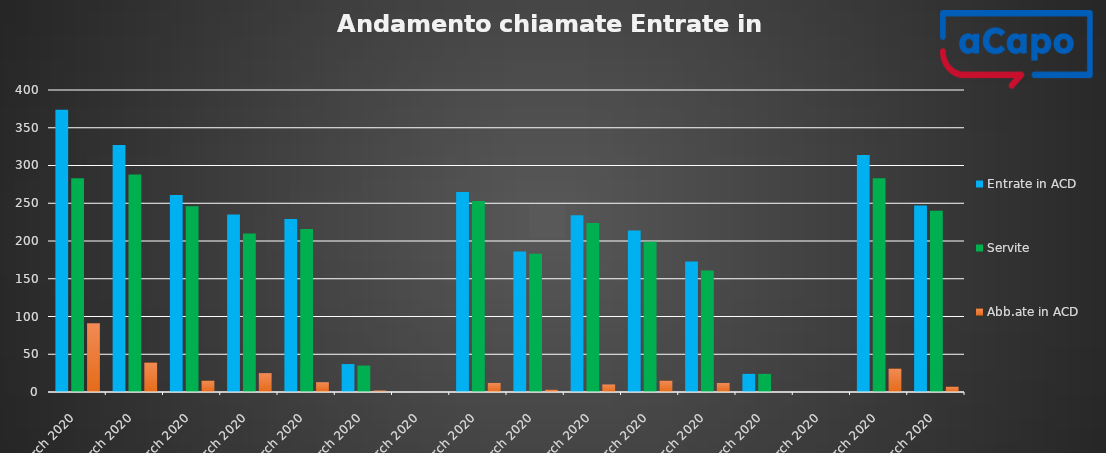
| Category | Entrate in ACD | Servite | Abb.ate in ACD |
|---|---|---|---|
| 2020-03-16 | 374 | 283 | 91 |
| 2020-03-17 | 327 | 288 | 39 |
| 2020-03-18 | 261 | 246 | 15 |
| 2020-03-19 | 235 | 210 | 25 |
| 2020-03-20 | 229 | 216 | 13 |
| 2020-03-21 | 37 | 35 | 2 |
| 2020-03-23 | 265 | 253 | 12 |
| 2020-03-24 | 186 | 183 | 3 |
| 2020-03-25 | 234 | 224 | 10 |
| 2020-03-26 | 214 | 199 | 15 |
| 2020-03-27 | 173 | 161 | 12 |
| 2020-03-28 | 24 | 24 | 0 |
| 2020-03-30 | 314 | 283 | 31 |
| 2020-03-31 | 247 | 240 | 7 |